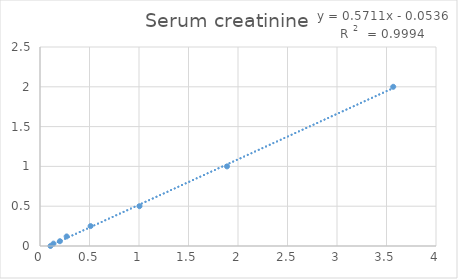
| Category | Serum creatinine |
|---|---|
| 0.106 | 0 |
| 0.136 | 0.03 |
| 0.201 | 0.06 |
| 0.269 | 0.12 |
| 0.511 | 0.25 |
| 1.005 | 0.5 |
| 1.889 | 1 |
| 3.568 | 2 |